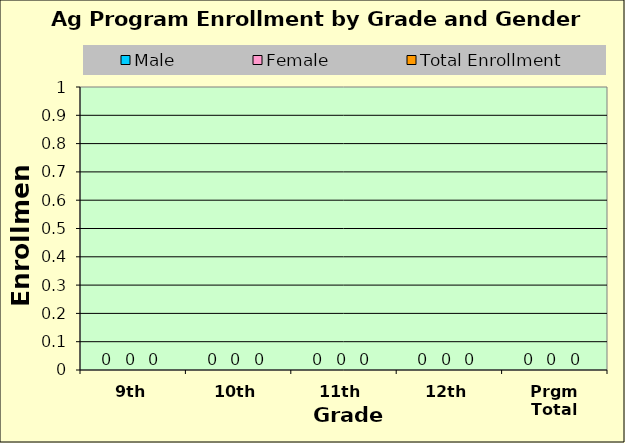
| Category | Male | Female | Total Enrollment |
|---|---|---|---|
| 9th | 0 | 0 | 0 |
| 10th | 0 | 0 | 0 |
| 11th | 0 | 0 | 0 |
| 12th | 0 | 0 | 0 |
| Prgm Total | 0 | 0 | 0 |